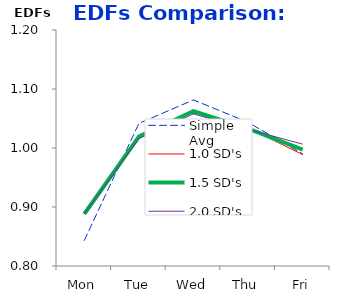
| Category | Simple Avg | 1.0 SD's | 1.5 SD's | 2.0 SD's |
|---|---|---|---|---|
| Mon | 0.843 | 0.892 | 0.888 | 0.888 |
| Tue | 1.042 | 1.022 | 1.019 | 1.016 |
| Wed | 1.082 | 1.063 | 1.063 | 1.058 |
| Thu | 1.043 | 1.034 | 1.033 | 1.032 |
| Fri | 0.99 | 0.989 | 0.997 | 1.006 |